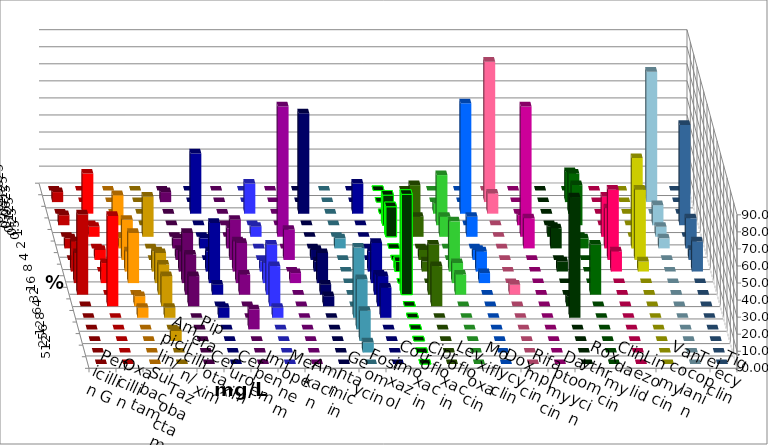
| Category | Penicillin G | Oxacillin | Ampicillin/ Sulbactam | Piperacillin/ Tazobactam | Cefotaxim | Cefuroxim | Imipenem | Meropenem | Amikacin | Gentamicin | Fosfomycin | Cotrimoxazol | Ciprofloxacin | Levofloxacin | Moxifloxacin | Doxycyclin | Rifampicin | Daptomycin | Roxythromycin | Clindamycin | Linezolid | Vancomycin | Teicoplanin | Tigecyclin |
|---|---|---|---|---|---|---|---|---|---|---|---|---|---|---|---|---|---|---|---|---|---|---|---|---|
| 0.015625 | 0 | 0 | 0 | 0 | 0 | 0 | 0 | 0 | 0 | 0 | 0 | 0 | 0 | 0 | 0 | 0 | 0 | 0 | 0 | 0 | 0 | 0 | 0 | 0 |
| 0.03125 | 5.882 | 0 | 0 | 0 | 5.882 | 0 | 0 | 0 | 0 | 0 | 0 | 0 | 0 | 0 | 0 | 0 | 82.353 | 0 | 0 | 17.647 | 0 | 0 | 0 | 76.471 |
| 0.0625 | 0 | 23.529 | 0 | 0 | 0 | 0 | 35.294 | 17.647 | 0 | 58.824 | 0 | 17.647 | 0 | 0 | 5.882 | 64.706 | 11.765 | 0 | 0 | 23.529 | 0 | 0 | 0 | 0 |
| 0.125 | 5.882 | 0 | 17.647 | 0 | 0 | 0 | 0 | 0 | 0 | 0 | 0 | 0 | 17.647 | 23.529 | 29.412 | 0 | 0 | 5.882 | 0 | 23.529 | 0 | 0 | 58.824 | 11.765 |
| 0.25 | 0 | 5.882 | 0 | 23.529 | 0 | 0 | 0 | 5.882 | 76.471 | 0 | 0 | 0 | 17.647 | 11.765 | 11.765 | 11.765 | 0 | 76.471 | 5.882 | 0 | 23.529 | 0 | 0 | 5.882 |
| 0.5 | 5.882 | 0 | 5.882 | 0 | 5.882 | 11.765 | 5.882 | 0 | 0 | 0 | 5.882 | 0 | 0 | 0 | 0 | 0 | 0 | 17.647 | 11.765 | 5.882 | 23.529 | 52.941 | 17.647 | 5.882 |
| 1.0 | 0 | 5.882 | 23.529 | 0 | 5.882 | 23.529 | 0 | 0 | 17.647 | 5.882 | 0 | 0 | 0 | 5.882 | 0 | 5.882 | 0 | 0 | 0 | 0 | 41.176 | 41.176 | 5.882 | 0 |
| 2.0 | 17.647 | 0 | 11.765 | 11.765 | 11.765 | 17.647 | 11.765 | 5.882 | 0 | 5.882 | 0 | 11.765 | 5.882 | 5.882 | 29.412 | 11.765 | 0 | 0 | 5.882 | 0 | 11.765 | 5.882 | 17.647 | 0 |
| 4.0 | 17.647 | 11.765 | 29.412 | 17.647 | 29.412 | 23.529 | 35.294 | 11.765 | 5.882 | 17.647 | 0 | 23.529 | 0 | 0 | 11.765 | 5.882 | 0 | 0 | 0 | 0 | 0 | 0 | 0 | 0 |
| 8.0 | 47.059 | 0 | 0 | 17.647 | 23.529 | 11.765 | 5.882 | 29.412 | 0 | 5.882 | 0 | 11.765 | 58.824 | 29.412 | 11.765 | 0 | 5.882 | 0 | 0 | 29.412 | 0 | 0 | 0 | 0 |
| 16.0 | 0 | 52.941 | 5.882 | 17.647 | 17.647 | 0 | 0 | 23.529 | 0 | 5.882 | 0 | 17.647 | 0 | 23.529 | 0 | 0 | 0 | 0 | 5.882 | 0 | 0 | 0 | 0 | 0 |
| 32.0 | 0 | 0 | 5.882 | 5.882 | 0 | 0 | 5.882 | 5.882 | 0 | 0 | 41.176 | 17.647 | 0 | 0 | 0 | 0 | 0 | 0 | 70.588 | 0 | 0 | 0 | 0 | 0 |
| 64.0 | 0 | 0 | 0 | 0 | 0 | 11.765 | 0 | 0 | 0 | 0 | 29.412 | 0 | 0 | 0 | 0 | 0 | 0 | 0 | 0 | 0 | 0 | 0 | 0 | 0 |
| 128.0 | 0 | 0 | 0 | 5.882 | 0 | 0 | 0 | 0 | 0 | 0 | 17.647 | 0 | 0 | 0 | 0 | 0 | 0 | 0 | 0 | 0 | 0 | 0 | 0 | 0 |
| 256.0 | 0 | 0 | 0 | 0 | 0 | 0 | 0 | 0 | 0 | 0 | 5.882 | 0 | 0 | 0 | 0 | 0 | 0 | 0 | 0 | 0 | 0 | 0 | 0 | 0 |
| 512.0 | 0 | 0 | 0 | 0 | 0 | 0 | 0 | 0 | 0 | 0 | 0 | 0 | 0 | 0 | 0 | 0 | 0 | 0 | 0 | 0 | 0 | 0 | 0 | 0 |